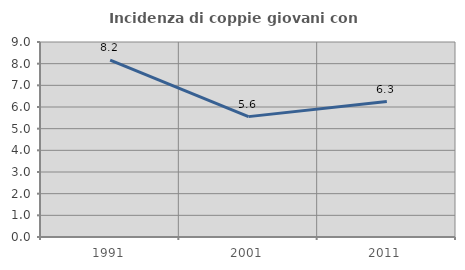
| Category | Incidenza di coppie giovani con figli |
|---|---|
| 1991.0 | 8.163 |
| 2001.0 | 5.556 |
| 2011.0 | 6.25 |